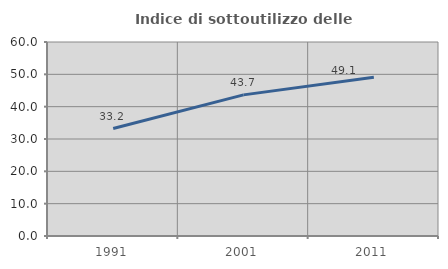
| Category | Indice di sottoutilizzo delle abitazioni  |
|---|---|
| 1991.0 | 33.246 |
| 2001.0 | 43.651 |
| 2011.0 | 49.123 |